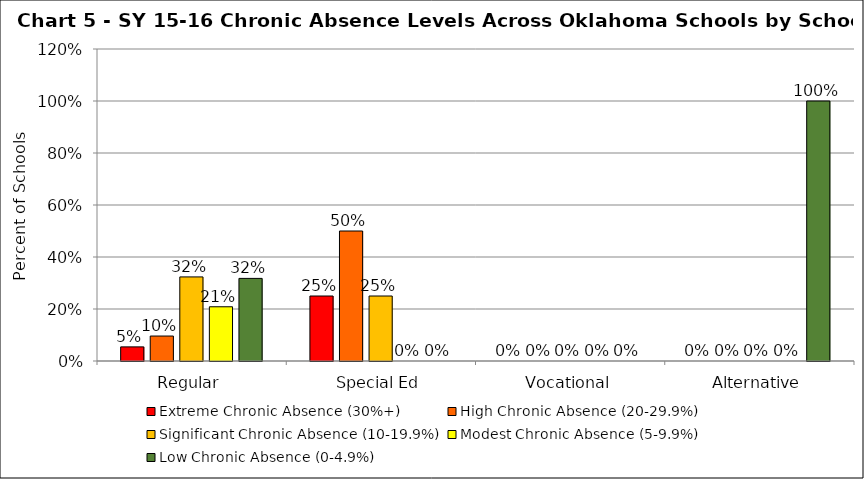
| Category | Extreme Chronic Absence (30%+) | High Chronic Absence (20-29.9%) | Significant Chronic Absence (10-19.9%) | Modest Chronic Absence (5-9.9%) | Low Chronic Absence (0-4.9%) |
|---|---|---|---|---|---|
| 0 | 0.054 | 0.096 | 0.323 | 0.209 | 0.318 |
| 1 | 0.25 | 0.5 | 0.25 | 0 | 0 |
| 2 | 0 | 0 | 0 | 0 | 0 |
| 3 | 0 | 0 | 0 | 0 | 1 |